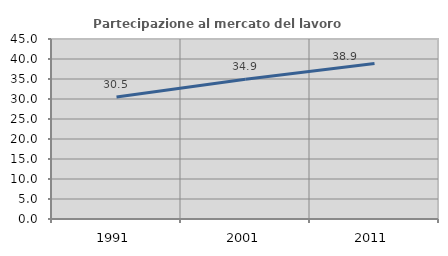
| Category | Partecipazione al mercato del lavoro  femminile |
|---|---|
| 1991.0 | 30.508 |
| 2001.0 | 34.946 |
| 2011.0 | 38.894 |